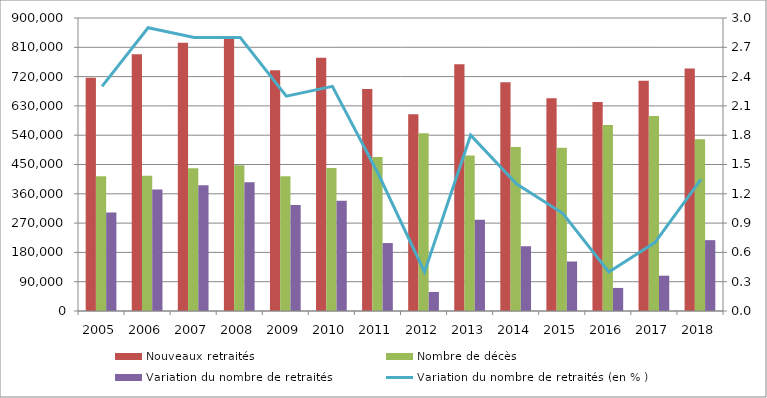
| Category | Nouveaux retraités | Nombre de décès | Variation du nombre de retraités  |
|---|---|---|---|
| 2005.0 | 716315 | 414123 | 302192 |
| 2006.0 | 788515 | 415109 | 373406 |
| 2007.0 | 824296 | 438184 | 386112 |
| 2008.0 | 842725 | 447463 | 395262 |
| 2009.0 | 739341 | 413839 | 325503 |
| 2010.0 | 777725 | 438981 | 338744 |
| 2011.0 | 681785 | 473158 | 208626 |
| 2012.0 | 604165 | 545630 | 58535 |
| 2013.0 | 758257 | 477940 | 280317 |
| 2014.0 | 702307 | 503375 | 198932 |
| 2015.0 | 653253 | 501215 | 152038 |
| 2016.0 | 642290 | 571411 | 70879 |
| 2017.0 | 707556 | 599083 | 108473 |
| 2018.0 | 745160.755 | 527553.481 | 217607.273 |